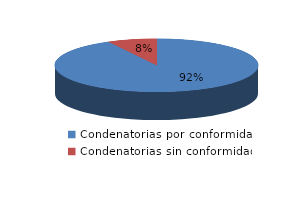
| Category | Series 0 |
|---|---|
| 0 | 378 |
| 1 | 32 |